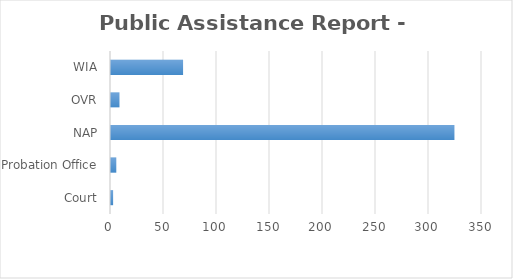
| Category | Series 0 |
|---|---|
| Court | 2 |
| Probation Office | 5 |
| NAP | 324 |
| OVR | 8 |
| WIA | 68 |